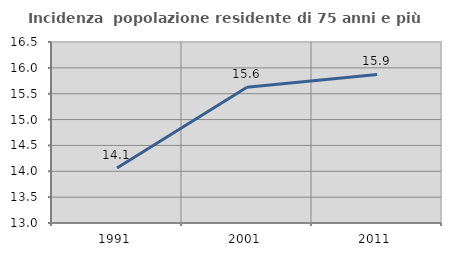
| Category | Incidenza  popolazione residente di 75 anni e più |
|---|---|
| 1991.0 | 14.062 |
| 2001.0 | 15.625 |
| 2011.0 | 15.873 |